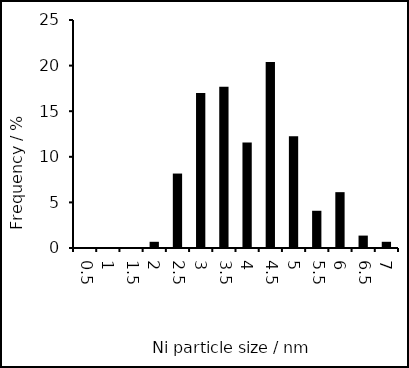
| Category | Series 0 |
|---|---|
| 0.5 | 0 |
| 1.0 | 0 |
| 1.5 | 0 |
| 2.0 | 0.68 |
| 2.5 | 8.163 |
| 3.0 | 17.007 |
| 3.5 | 17.687 |
| 4.0 | 11.565 |
| 4.5 | 20.408 |
| 5.0 | 12.245 |
| 5.5 | 4.082 |
| 6.0 | 6.122 |
| 6.5 | 1.361 |
| 7.0 | 0.68 |